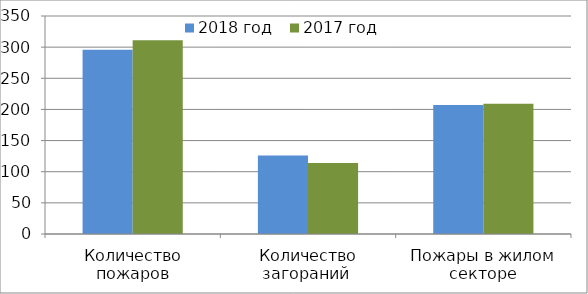
| Category | 2018 год | 2017 год |
|---|---|---|
| Количество пожаров | 296 | 311 |
| Количество загораний  | 126 | 114 |
| Пожары в жилом секторе | 207 | 209 |